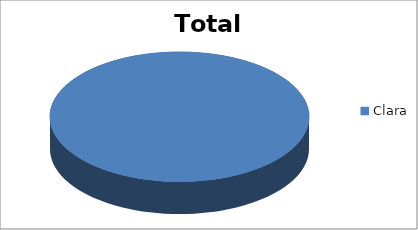
| Category | Total |
|---|---|
| Clara | 1 |